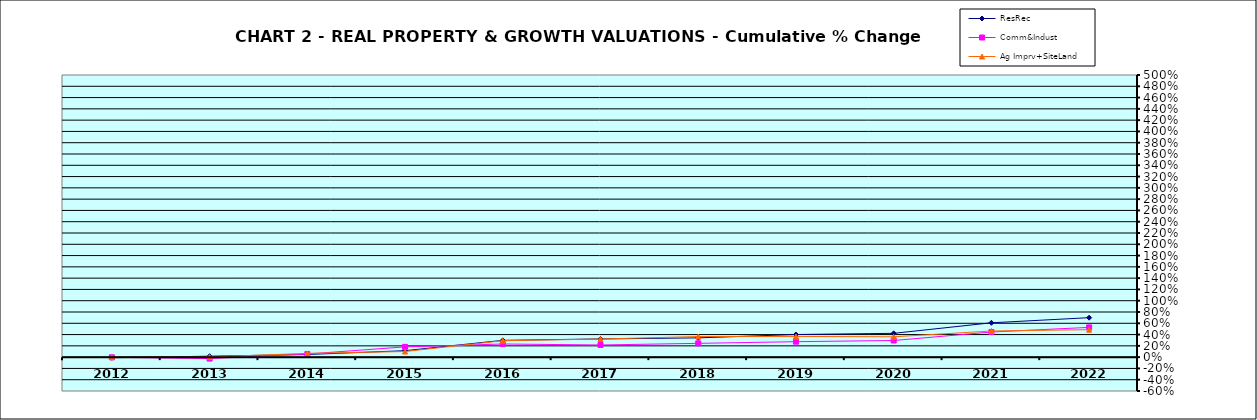
| Category | ResRec | Comm&Indust | Ag Imprv+SiteLand |
|---|---|---|---|
| 2012.0 | -0.01 | -0.003 | 0 |
| 2013.0 | 0.017 | -0.025 | 0.003 |
| 2014.0 | 0.047 | 0.055 | 0.067 |
| 2015.0 | 0.115 | 0.182 | 0.1 |
| 2016.0 | 0.298 | 0.233 | 0.291 |
| 2017.0 | 0.323 | 0.216 | 0.32 |
| 2018.0 | 0.341 | 0.244 | 0.366 |
| 2019.0 | 0.401 | 0.274 | 0.367 |
| 2020.0 | 0.422 | 0.295 | 0.361 |
| 2021.0 | 0.609 | 0.446 | 0.463 |
| 2022.0 | 0.699 | 0.527 | 0.487 |